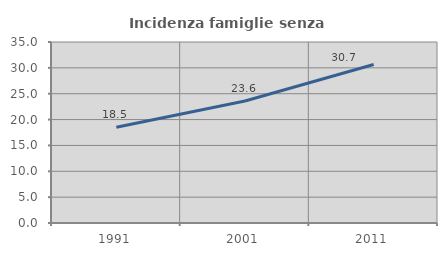
| Category | Incidenza famiglie senza nuclei |
|---|---|
| 1991.0 | 18.516 |
| 2001.0 | 23.587 |
| 2011.0 | 30.655 |